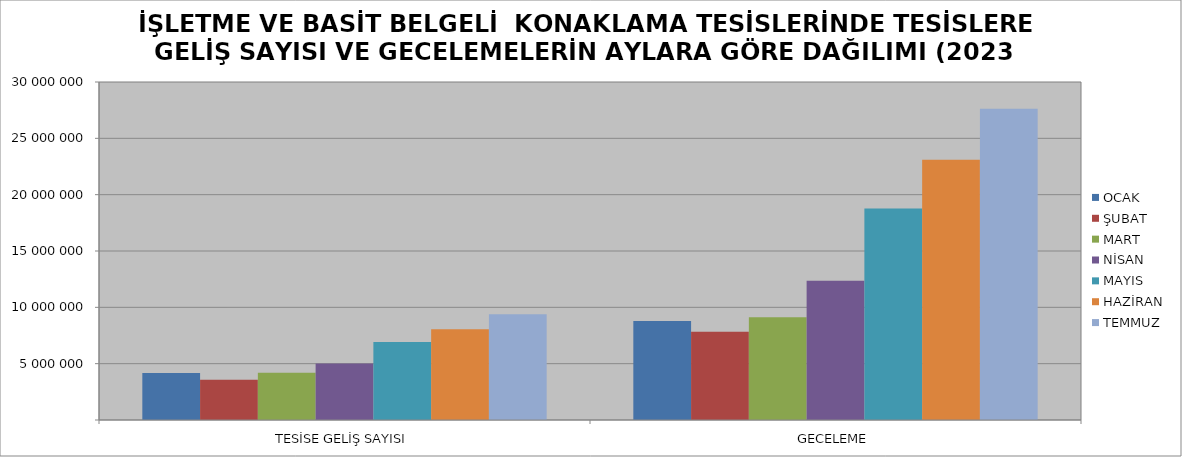
| Category | OCAK | ŞUBAT | MART | NİSAN | MAYIS | HAZİRAN | TEMMUZ |
|---|---|---|---|---|---|---|---|
| TESİSE GELİŞ SAYISI | 4176369 | 3577989 | 4200030 | 5022587 | 6927000 | 8050681 | 9379348 |
| GECELEME | 8783046 | 7837722 | 9122802 | 12360237 | 18778808 | 23106038 | 27617279 |